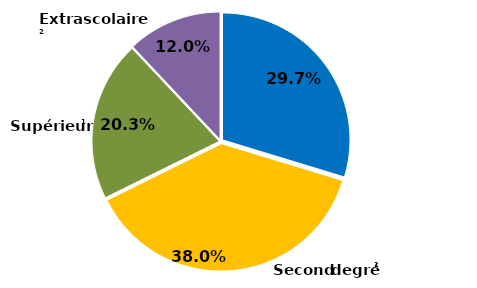
| Category | Series 0 |
|---|---|
| Premier degré | 0.297 |
| Second degré | 0.38 |
| Supérieur | 0.203 |
| Extrascolaire | 0.12 |